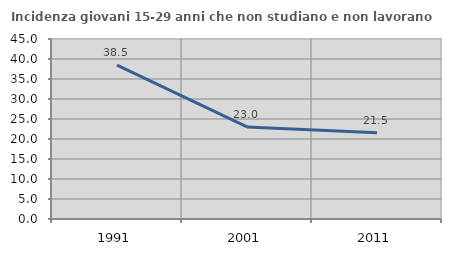
| Category | Incidenza giovani 15-29 anni che non studiano e non lavorano  |
|---|---|
| 1991.0 | 38.462 |
| 2001.0 | 23.017 |
| 2011.0 | 21.538 |